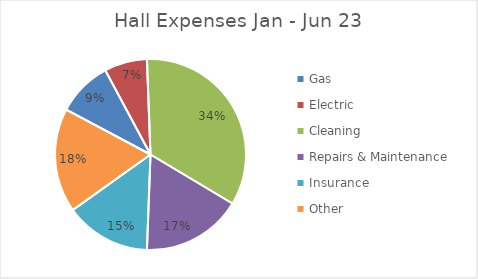
| Category | Expenditure |
|---|---|
| Gas | 1306.42 |
| Electric | 1009.22 |
| Cleaning | 4761.66 |
| Repairs & Maintenance | 2371.74 |
| Insurance | 2023.48 |
| Other | 2460.35 |